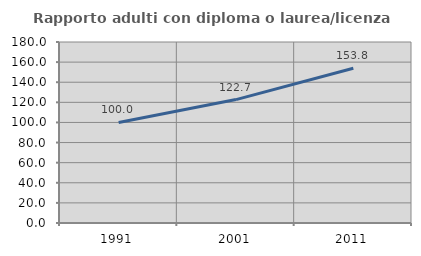
| Category | Rapporto adulti con diploma o laurea/licenza media  |
|---|---|
| 1991.0 | 100 |
| 2001.0 | 122.727 |
| 2011.0 | 153.846 |